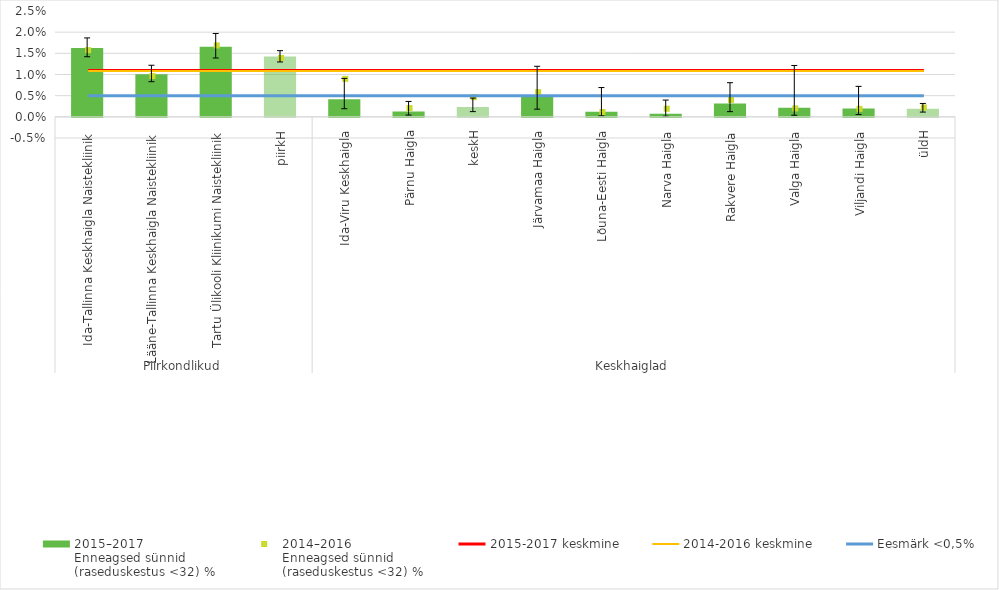
| Category | 2015–2017
Enneagsed sünnid
(raseduskestus <32) % |
|---|---|
| 0 | 0.016 |
| 1 | 0.01 |
| 2 | 0.017 |
| 3 | 0.014 |
| 4 | 0.004 |
| 5 | 0.001 |
| 6 | 0.002 |
| 7 | 0.005 |
| 8 | 0.001 |
| 9 | 0.001 |
| 10 | 0.003 |
| 11 | 0.002 |
| 12 | 0.002 |
| 13 | 0.002 |